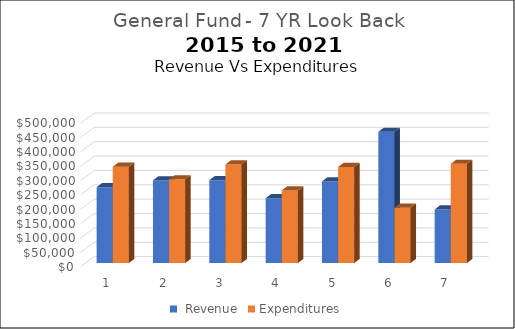
| Category |  Revenue | Expenditures |
|---|---|---|
| 0 | 264267 | 335606 |
| 1 | 288260 | 291552 |
| 2 | 288668 | 343185 |
| 3 | 226006 | 253112 |
| 4 | 284491 | 334646 |
| 5 | 457159 | 192981 |
| 6 | 186855 | 345535 |